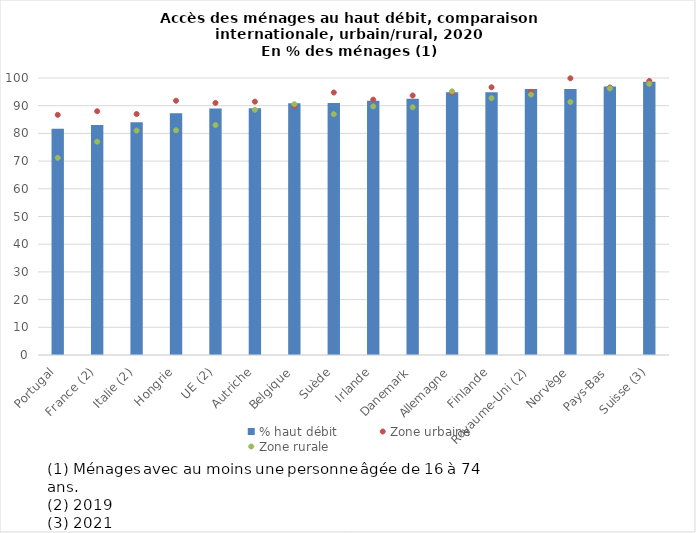
| Category | % haut débit |
|---|---|
| Portugal | 81.666 |
| France (2) | 83 |
| Italie (2) | 84 |
| Hongrie | 87.231 |
| UE (2) | 89 |
| Autriche | 89.105 |
| Belgique | 90.861 |
| Suède | 91 |
| Irlande | 91.823 |
| Danemark | 92.501 |
| Allemagne | 94.827 |
| Finlande | 94.827 |
| Royaume-Uni (2) | 96 |
| Norvège | 96.008 |
| Pays-Bas | 96.953 |
| Suisse (3) | 98.673 |